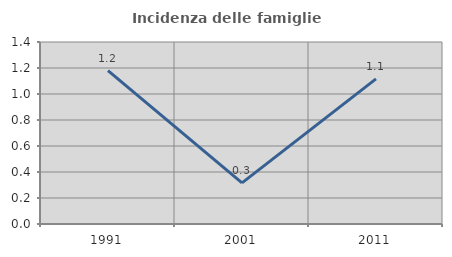
| Category | Incidenza delle famiglie numerose |
|---|---|
| 1991.0 | 1.18 |
| 2001.0 | 0.317 |
| 2011.0 | 1.116 |